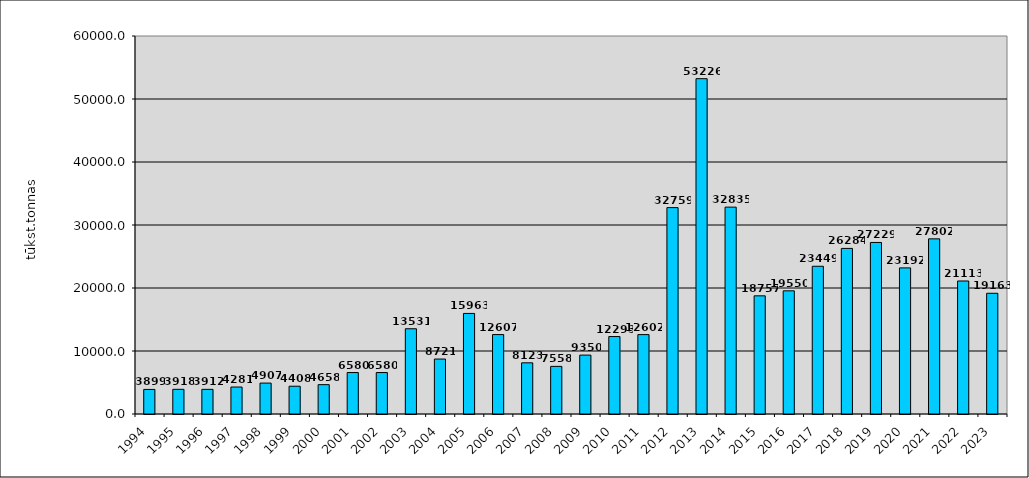
| Category | Series 0 |
|---|---|
| 1994.0 | 3899 |
| 1995.0 | 3918 |
| 1996.0 | 3912 |
| 1997.0 | 4281 |
| 1998.0 | 4907 |
| 1999.0 | 4408 |
| 2000.0 | 4658 |
| 2001.0 | 6580 |
| 2002.0 | 6580 |
| 2003.0 | 13531 |
| 2004.0 | 8721 |
| 2005.0 | 15963 |
| 2006.0 | 12607 |
| 2007.0 | 8123 |
| 2008.0 | 7558 |
| 2009.0 | 9350 |
| 2010.0 | 12293 |
| 2011.0 | 12602 |
| 2012.0 | 32759 |
| 2013.0 | 53226 |
| 2014.0 | 32835 |
| 2015.0 | 18757 |
| 2016.0 | 19550 |
| 2017.0 | 23449 |
| 2018.0 | 26284 |
| 2019.0 | 27229 |
| 2020.0 | 23192 |
| 2021.0 | 27802 |
| 2022.0 | 21113 |
| 2023.0 | 19163 |